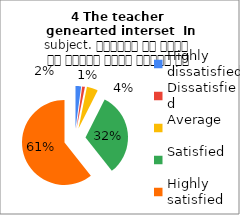
| Category | 4 The teacher 
genearted interset  In subject. शिक्षक ने विषय के प्रति रुचि जागृत की |
|---|---|
| Highly dissatisfied | 2 |
| Dissatisfied | 1 |
| Average | 4 |
| Satisfied | 30 |
| Highly satisfied | 57 |